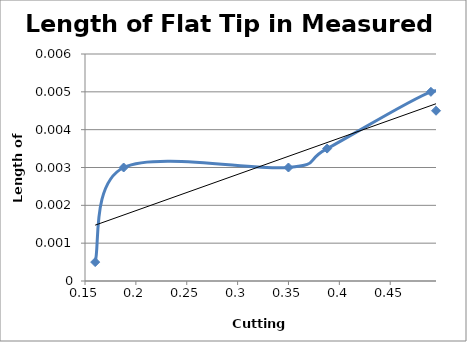
| Category | Flat Length  |
|---|---|
| 0.16 | 0 |
| 0.188 | 0.003 |
| 0.35 | 0.003 |
| 0.388 | 0.004 |
| 0.49 | 0.005 |
| 0.495 | 0.004 |